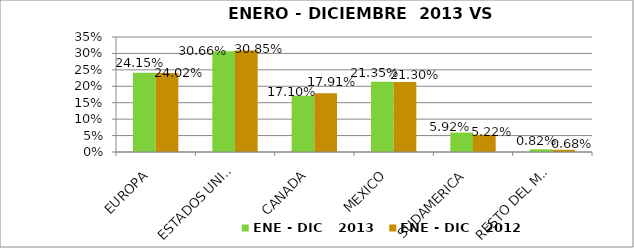
| Category | ENE - DIC   2013 | ENE - DIC   2012 |
|---|---|---|
| EUROPA | 0.242 | 0.24 |
| ESTADOS UNIDOS | 0.307 | 0.309 |
| CANADA | 0.171 | 0.179 |
| MEXICO | 0.213 | 0.213 |
| SUDAMERICA | 0.059 | 0.052 |
| RESTO DEL MUNDO | 0.008 | 0.007 |